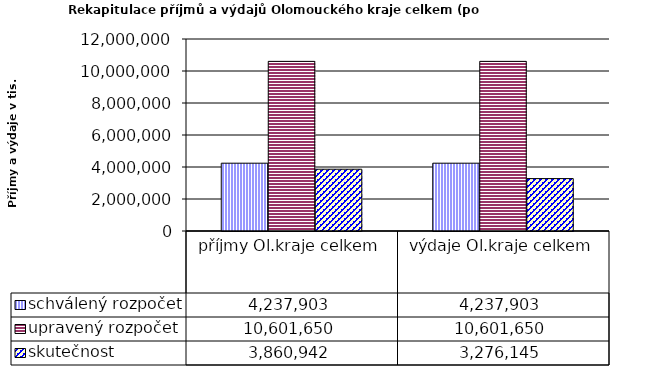
| Category | schválený rozpočet | upravený rozpočet | skutečnost |
|---|---|---|---|
| příjmy Ol.kraje celkem | 4237903 | 10601650 | 3860942 |
| výdaje Ol.kraje celkem | 4237903 | 10601650 | 3276145 |